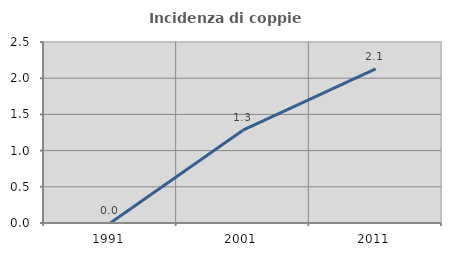
| Category | Incidenza di coppie miste |
|---|---|
| 1991.0 | 0 |
| 2001.0 | 1.282 |
| 2011.0 | 2.128 |